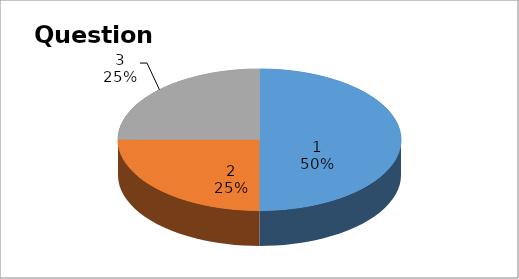
| Category | Series 0 |
|---|---|
| 0 | 4 |
| 1 | 2 |
| 2 | 2 |